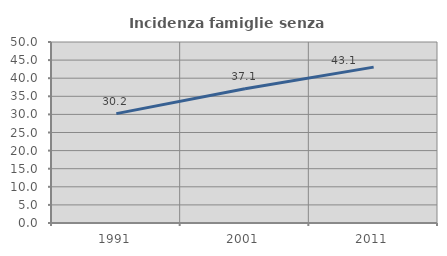
| Category | Incidenza famiglie senza nuclei |
|---|---|
| 1991.0 | 30.221 |
| 2001.0 | 37.108 |
| 2011.0 | 43.056 |